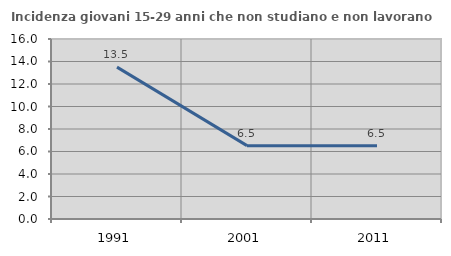
| Category | Incidenza giovani 15-29 anni che non studiano e non lavorano  |
|---|---|
| 1991.0 | 13.499 |
| 2001.0 | 6.522 |
| 2011.0 | 6.522 |